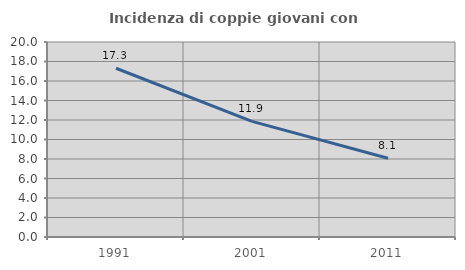
| Category | Incidenza di coppie giovani con figli |
|---|---|
| 1991.0 | 17.308 |
| 2001.0 | 11.857 |
| 2011.0 | 8.082 |